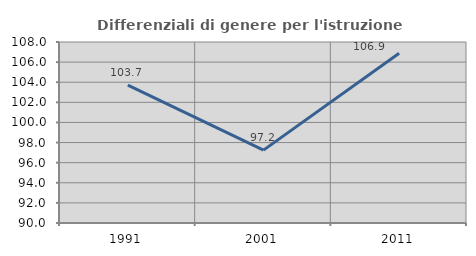
| Category | Differenziali di genere per l'istruzione superiore |
|---|---|
| 1991.0 | 103.72 |
| 2001.0 | 97.248 |
| 2011.0 | 106.873 |